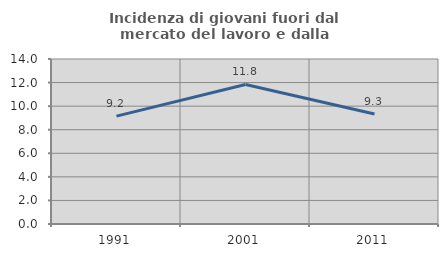
| Category | Incidenza di giovani fuori dal mercato del lavoro e dalla formazione  |
|---|---|
| 1991.0 | 9.156 |
| 2001.0 | 11.842 |
| 2011.0 | 9.341 |